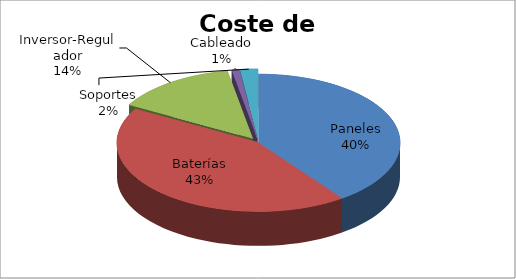
| Category | Series 0 |
|---|---|
| Paneles | 4032 |
| Baterías | 4358 |
| Inversor-Regulador | 1412 |
| Cableado | 82 |
| Soportes | 205 |